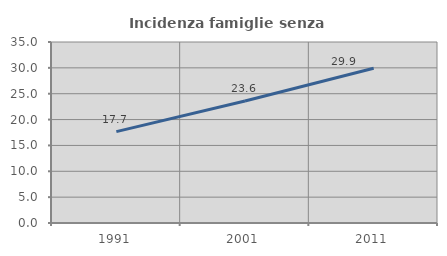
| Category | Incidenza famiglie senza nuclei |
|---|---|
| 1991.0 | 17.668 |
| 2001.0 | 23.591 |
| 2011.0 | 29.936 |